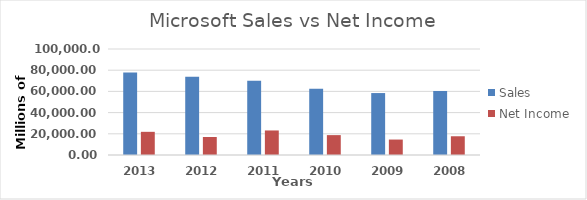
| Category | Sales | Net Income |
|---|---|---|
| 2013.0 | 77849 | 21863 |
| 2012.0 | 73723 | 16978 |
| 2011.0 | 69943 | 23150 |
| 2010.0 | 62484 | 18760 |
| 2009.0 | 58437 | 14569 |
| 2008.0 | 60420 | 17681 |